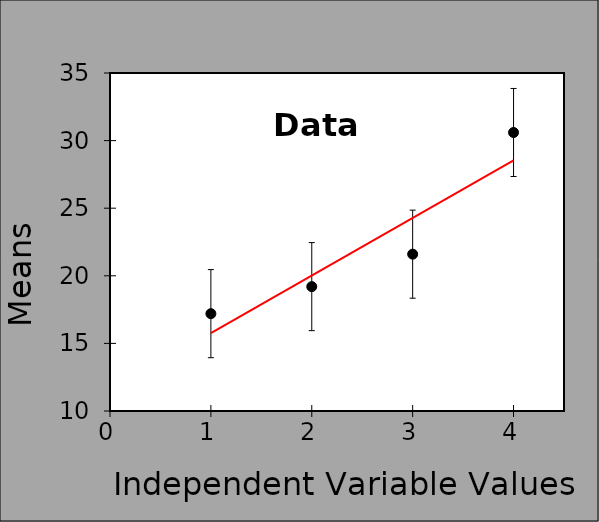
| Category | Series 0 |
|---|---|
| 1.0 | 17.2 |
| 2.0 | 19.2 |
| 3.0 | 21.6 |
| 4.0 | 30.6 |